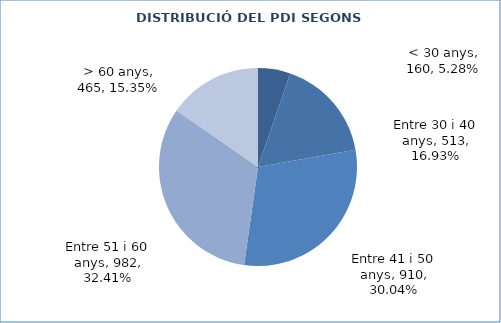
| Category | Series 0 |
|---|---|
| < 30 anys | 160 |
| Entre 30 i 40 anys | 513 |
| Entre 41 i 50 anys | 910 |
| Entre 51 i 60 anys | 982 |
| > 60 anys | 465 |